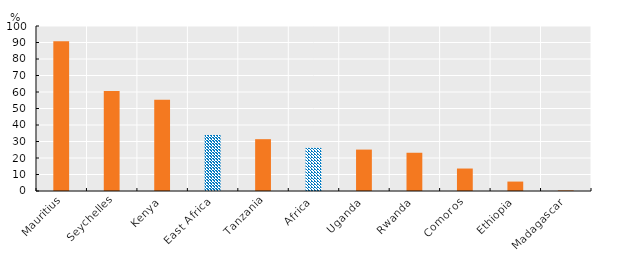
| Category | Series 0 |
|---|---|
| Mauritius | 90.747 |
| Seychelles | 60.592 |
| Kenya | 55.299 |
| East Africa | 34.002 |
| Tanzania | 31.409 |
| Africa | 26.155 |
| Uganda | 25.1 |
| Rwanda | 23.181 |
| Comoros | 13.619 |
| Ethiopia | 5.713 |
| Madagascar | 0.359 |